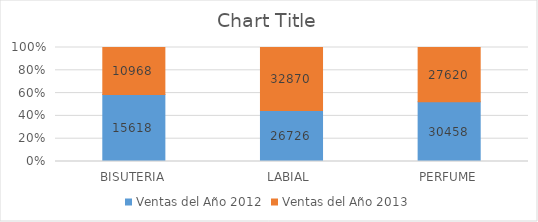
| Category | Ventas del Año 2012 | Ventas del Año 2013 |
|---|---|---|
| BISUTERIA | 15618 | 10968 |
| LABIAL  | 26726 | 32870 |
| PERFUME | 30458 | 27620 |